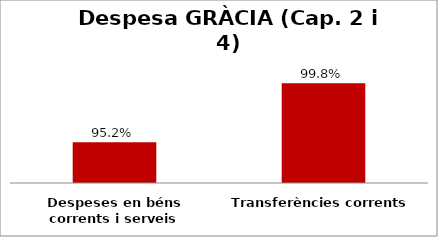
| Category | Series 0 |
|---|---|
| Despeses en béns corrents i serveis | 0.952 |
| Transferències corrents | 0.998 |